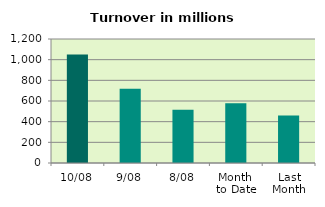
| Category | Series 0 |
|---|---|
| 10/08 | 1050.65 |
| 9/08 | 718.357 |
| 8/08 | 515.084 |
| Month 
to Date | 578.97 |
| Last
Month | 459.043 |